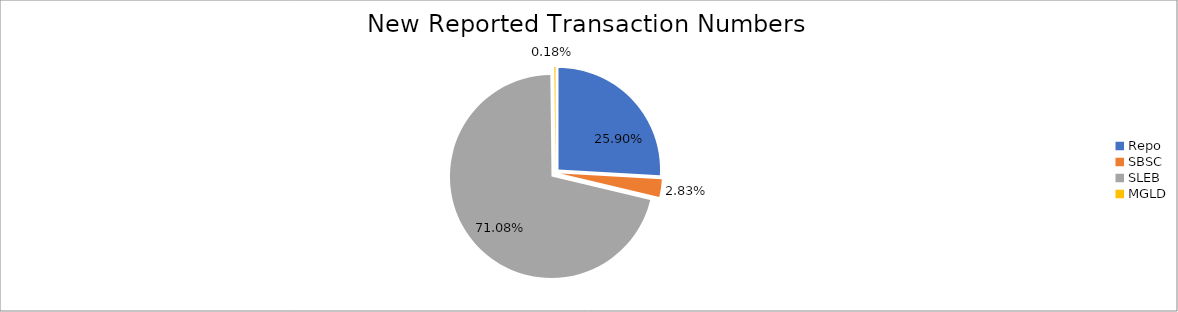
| Category | Series 0 |
|---|---|
| Repo | 392067 |
| SBSC | 42777 |
| SLEB | 1075854 |
| MGLD | 2798 |